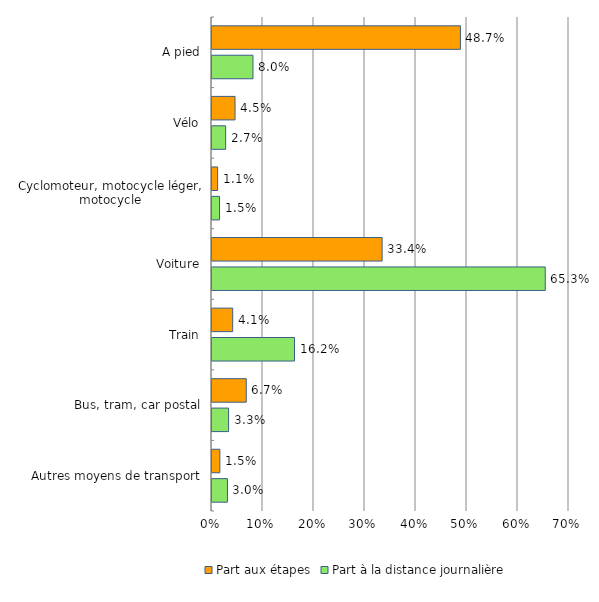
| Category | Part aux étapes | Part à la distance journalière |
|---|---|---|
| A pied | 48.708 | 8.038 |
| Vélo | 4.516 | 2.681 |
| Cyclomoteur, motocycle léger, motocycle | 1.101 | 1.475 |
| Voiture | 33.357 | 65.346 |
| Train | 4.059 | 16.179 |
| Bus, tram, car postal | 6.718 | 3.253 |
| Autres moyens de transport | 1.54 | 3.029 |